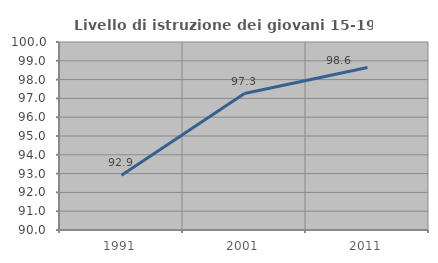
| Category | Livello di istruzione dei giovani 15-19 anni |
|---|---|
| 1991.0 | 92.915 |
| 2001.0 | 97.26 |
| 2011.0 | 98.639 |